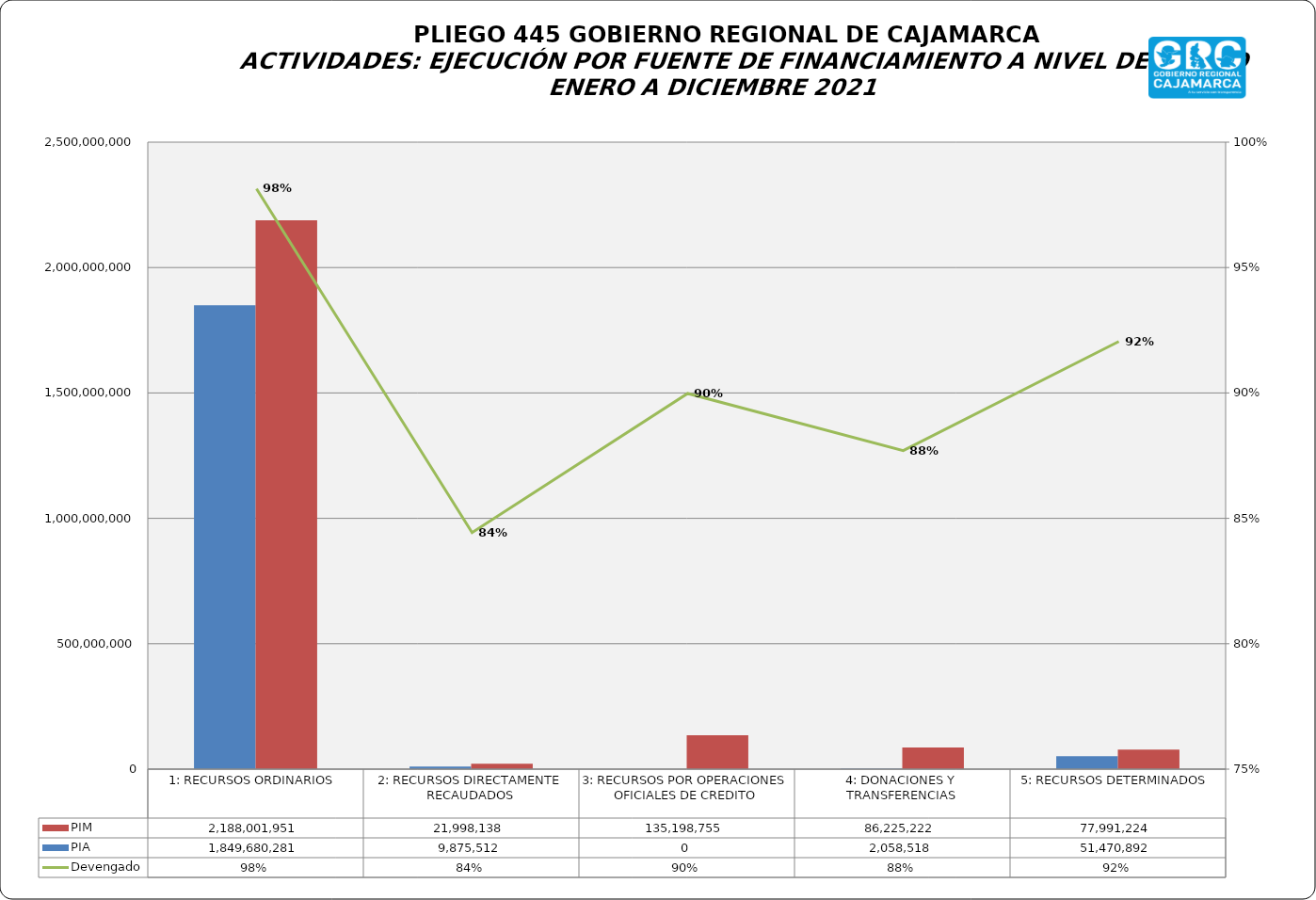
| Category | PIA | PIM |
|---|---|---|
| 1: RECURSOS ORDINARIOS | 1849680281 | 2188001951 |
| 2: RECURSOS DIRECTAMENTE RECAUDADOS | 9875512 | 21998138 |
| 3: RECURSOS POR OPERACIONES OFICIALES DE CREDITO | 0 | 135198755 |
| 4: DONACIONES Y TRANSFERENCIAS | 2058518 | 86225222 |
| 5: RECURSOS DETERMINADOS | 51470892 | 77991224 |